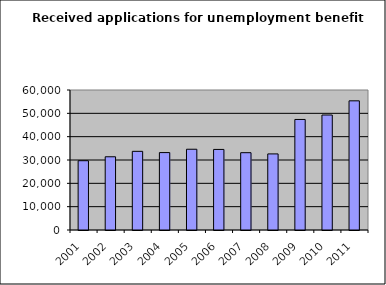
| Category | Series 1 |
|---|---|
| 2001.0 | 29694 |
| 2002.0 | 31386 |
| 2003.0 | 33712 |
| 2004.0 | 33179 |
| 2005.0 | 34612 |
| 2006.0 | 34527 |
| 2007.0 | 33131 |
| 2008.0 | 32607 |
| 2009.0 | 47377 |
| 2010.0 | 49282 |
| 2011.0 | 55357 |